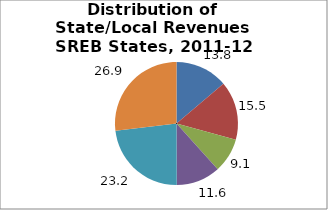
| Category | Series 0 |
|---|---|
| General Sales | 13.797 |
| Property | 15.473 |
| Income1 | 9.06 |
| Other | 11.607 |
| From Federal Government | 23.183 |
| Nontax Revenues2 | 26.879 |